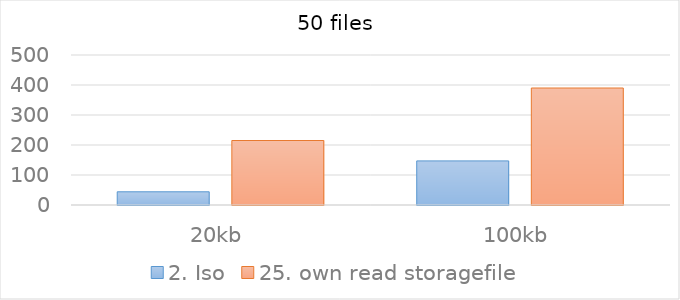
| Category | 2. Iso | 25. own read storagefile |
|---|---|---|
| 20kb | 44 | 215 |
| 100kb | 147 | 390 |